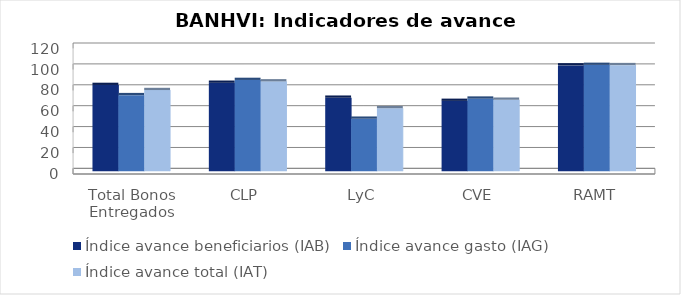
| Category | Índice avance beneficiarios (IAB)  | Índice avance gasto (IAG) | Índice avance total (IAT)  |
|---|---|---|---|
| Total Bonos Entregados | 82.489 | 72.725 | 77.607 |
| CLP | 84.563 | 87.273 | 85.918 |
| LyC | 70.262 | 50.167 | 60.215 |
| CVE | 67.255 | 69.407 | 68.331 |
| RAMT | 101.223 | 101.701 | 101.462 |